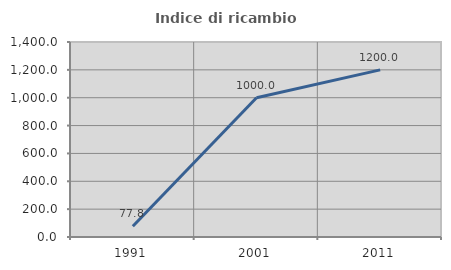
| Category | Indice di ricambio occupazionale  |
|---|---|
| 1991.0 | 77.778 |
| 2001.0 | 1000 |
| 2011.0 | 1200 |